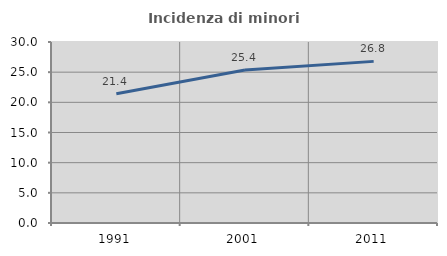
| Category | Incidenza di minori stranieri |
|---|---|
| 1991.0 | 21.429 |
| 2001.0 | 25.362 |
| 2011.0 | 26.788 |